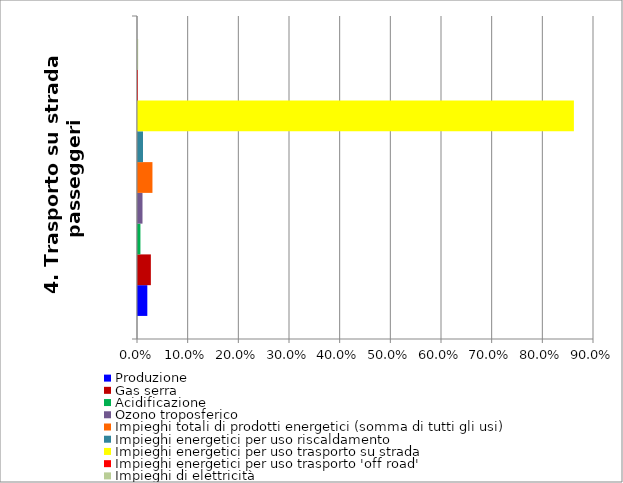
| Category | Produzione | Gas serra | Acidificazione | Ozono troposferico | Impieghi totali di prodotti energetici (somma di tutti gli usi) | Impieghi energetici per uso riscaldamento | Impieghi energetici per uso trasporto su strada | Impieghi energetici per uso trasporto 'off road' | Impieghi di elettricità |
|---|---|---|---|---|---|---|---|---|---|
| 4. Trasporto su strada passeggeri  | 0.018 | 0.025 | 0.005 | 0.009 | 0.029 | 0.01 | 0.86 | 0 | 0 |